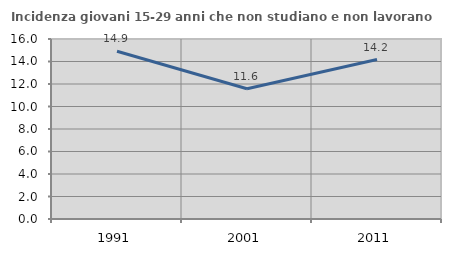
| Category | Incidenza giovani 15-29 anni che non studiano e non lavorano  |
|---|---|
| 1991.0 | 14.908 |
| 2001.0 | 11.572 |
| 2011.0 | 14.174 |